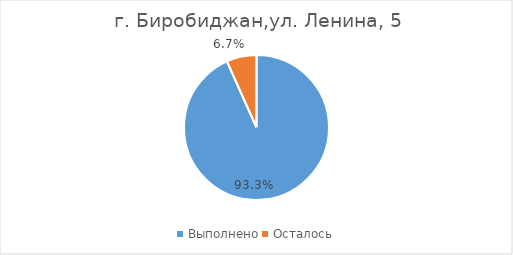
| Category |  г. Биробиджан,ул. Ленина, 5 |
|---|---|
| Выполнено | 0.933 |
| Осталось | 0.067 |